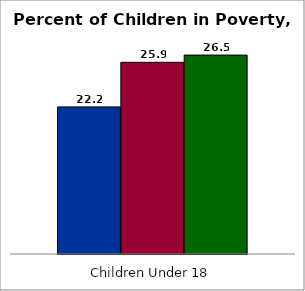
| Category | 50 states and D.C. | SREB states3 | State |
|---|---|---|---|
| 0 | 22.2 | 25.9 | 26.5 |